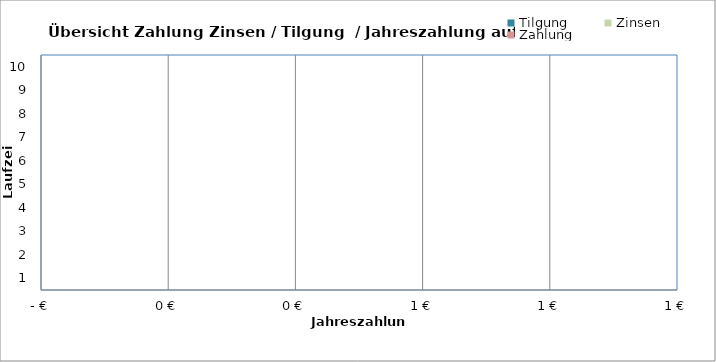
| Category | Tilgung | Zinsen | Zahlung |
|---|---|---|---|
| 0 | 0 | 0 | 0 |
| 1 | 0 | 0 | 0 |
| 2 | 0 | 0 | 0 |
| 3 | 0 | 0 | 0 |
| 4 | 0 | 0 | 0 |
| 5 | 0 | 0 | 0 |
| 6 | 0 | 0 | 0 |
| 7 | 0 | 0 | 0 |
| 8 | 0 | 0 | 0 |
| 9 | 0 | 0 | 0 |